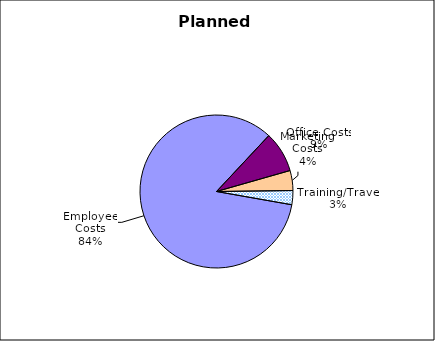
| Category | Planned Expense |
|---|---|
| Employee Costs | 1355090 |
| Office Costs | 138740 |
| Marketing Costs | 67800 |
| Training/Travel | 48000 |